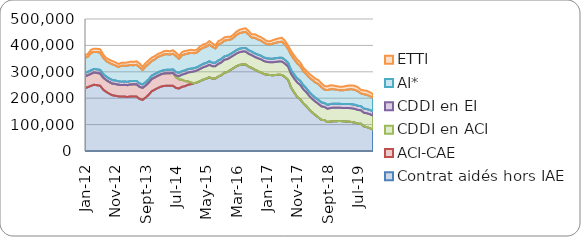
| Category | Contrat aidés hors IAE | ACI-CAE | CDDI en ACI | CDDI en EI | AI* | ETTI |
|---|---|---|---|---|---|---|
| 2012-01-01 | 237785 | 44848 | 7 | 13194 | 56827 | 10405 |
| 2012-02-01 | 242074 | 45184 | 7 | 13142 | 57340 | 10618 |
| 2012-03-01 | 246796 | 45652 | 8 | 13343 | 66093 | 11906 |
| 2012-04-01 | 250992 | 46298 | 9 | 13502 | 64489 | 12020 |
| 2012-05-01 | 249014 | 46348 | 11 | 13611 | 65988 | 12019 |
| 2012-06-01 | 247263 | 46286 | 11 | 13730 | 65047 | 13131 |
| 2012-07-01 | 232485 | 45635 | 12 | 13729 | 60846 | 13000 |
| 2012-08-01 | 223825 | 44702 | 14 | 13555 | 58655 | 11536 |
| 2012-09-01 | 216938 | 44382 | 17 | 13399 | 59007 | 12350 |
| 2012-10-01 | 210990 | 44248 | 18 | 13380 | 59663 | 12602 |
| 2012-11-01 | 209295 | 44434 | 23 | 13281 | 56994 | 12270 |
| 2012-12-01 | 206927 | 44101 | 24 | 13060 | 53786 | 11784 |
| 2013-01-01 | 205907 | 43798 | 34 | 12834 | 60509 | 11172 |
| 2013-02-01 | 206160 | 44418 | 40 | 12826 | 59116 | 11595 |
| 2013-03-01 | 204579 | 44790 | 54 | 12681 | 61223 | 12202 |
| 2013-04-01 | 206628 | 45345 | 71 | 12829 | 60623 | 12795 |
| 2013-05-01 | 206813 | 45599 | 82 | 12848 | 59330 | 12809 |
| 2013-06-01 | 206187 | 46095 | 93 | 13026 | 61038 | 13410 |
| 2013-07-01 | 196970 | 45988 | 111 | 13146 | 61170 | 14219 |
| 2013-08-01 | 193757 | 45309 | 130 | 12918 | 54934 | 12388 |
| 2013-09-01 | 202249 | 45340 | 171 | 12930 | 58926 | 13414 |
| 2013-10-01 | 212900 | 45539 | 205 | 12967 | 58252 | 13732 |
| 2013-11-01 | 226077 | 46096 | 252 | 12853 | 55422 | 12910 |
| 2013-12-01 | 232333 | 46014 | 293 | 12821 | 55158 | 12575 |
| 2014-01-01 | 238519 | 45928 | 308 | 12621 | 58696.797 | 11478 |
| 2014-02-01 | 243617 | 46338 | 306 | 12626 | 57345.516 | 11258 |
| 2014-03-01 | 246353 | 46693 | 313 | 12719 | 59389.413 | 12354 |
| 2014-04-01 | 247451 | 47122 | 315 | 12914 | 58807.382 | 12977 |
| 2014-05-01 | 247315 | 47121 | 302 | 12956 | 57553.107 | 12548 |
| 2014-06-01 | 247042 | 48488 | 318 | 13239 | 59209.953 | 13420 |
| 2014-07-01 | 238890 | 40457 | 6940 | 13160 | 59964 | 13345 |
| 2014-08-01 | 236693 | 34754 | 11660 | 12925 | 53350 | 11352 |
| 2014-09-01 | 243073 | 27006 | 19338 | 13025 | 59881 | 12517 |
| 2014-10-01 | 245548 | 19225 | 27417 | 13017 | 61270 | 12452 |
| 2014-11-01 | 250667 | 12975 | 33878 | 12914 | 58983 | 11655 |
| 2014-12-01 | 253351 | 6151 | 39589 | 12825 | 59612 | 11767 |
| 2015-01-01 | 256470 | 42 | 44848 | 12679 | 56326 | 10779 |
| 2015-02-01 | 259707 | 14 | 45282 | 12631 | 55861 | 11126 |
| 2015-03-01 | 264893 | 7 | 46062 | 12836 | 60557 | 12000 |
| 2015-04-01 | 270425 | 4 | 46551 | 13017 | 61199 | 12554 |
| 2015-05-01 | 274012 | 2 | 46659 | 13065 | 60705 | 12297 |
| 2015-06-01 | 279212 | 2 | 47282 | 13391 | 62866 | 13518 |
| 2015-07-01 | 274133 | 0 | 47007 | 13324 | 60259 | 13458 |
| 2015-08-01 | 274794 | 0 | 46597 | 13160 | 53778 | 11609 |
| 2015-09-01 | 282235 | 0 | 47696 | 13210 | 60301 | 12751 |
| 2015-10-01 | 287385 | 0 | 48336 | 13149 | 59696 | 13129 |
| 2015-11-01 | 296639 | 0 | 48919 | 13239 | 58958 | 12795 |
| 2015-12-01 | 299593 | 0 | 48471 | 13046 | 59158 | 12273 |
| 2016-01-01 | 307271 | 0 | 47593 | 12882 | 54191 | 11102 |
| 2016-02-01 | 314141 | 123 | 47606 | 12909 | 54239 | 11853 |
| 2016-03-01 | 321297 | 125 | 47900 | 13204 | 57281 | 12601 |
| 2016-04-01 | 326134 | 123 | 48128 | 13316 | 58553 | 13016 |
| 2016-05-01 | 328030 | 132 | 48299 | 13499 | 59216 | 13484 |
| 2016-06-01 | 327510 | 127 | 48768 | 13788 | 60936 | 14075 |
| 2016-07-01 | 319399 | 120 | 48513 | 13680 | 58648 | 14002 |
| 2016-08-01 | 314665 | 113 | 47983 | 13655 | 53099 | 12513 |
| 2016-09-01 | 308031 | 105 | 48138 | 13782 | 58580 | 13801 |
| 2016-10-01 | 302249 | 144 | 48993 | 13837 | 57605 | 13373 |
| 2016-11-01 | 297575 | 135 | 49687 | 13846 | 56825 | 13523 |
| 2016-12-01 | 291624 | 41 | 48985 | 13671 | 56446 | 13239 |
| 2017-01-01 | 289138 | 164 | 48026 | 13601 | 53622 | 11946 |
| 2017-02-01 | 287719 | 184 | 48254 | 13723 | 53182 | 12434 |
| 2017-03-01 | 286897 | 183 | 48834 | 13882 | 56855 | 13363 |
| 2017-04-01 | 287997 | 184 | 49476 | 14016 | 58369 | 13649 |
| 2017-05-01 | 288800 | 185 | 49783 | 14331 | 59572 | 14367 |
| 2017-06-01 | 287792 | 220 | 50443 | 14608 | 60970 | 14994 |
| 2017-07-01 | 279641 | 215 | 50564 | 14574 | 57638 | 14540 |
| 2017-08-01 | 269373 | 212 | 49999 | 14586 | 51835 | 13053 |
| 2017-09-01 | 239920 | 252 | 51130 | 14764 | 57781 | 14401 |
| 2017-10-01 | 221546 | 241 | 52627 | 15118 | 57430 | 14422 |
| 2017-11-01 | 205159 | 238 | 54068 | 15526 | 56745 | 14346 |
| 2017-12-01 | 195507 | 132 | 54702 | 15624 | 55809 | 13561 |
| 2018-01-01 | 180717 | 58 | 53153 | 15374 | 53308 | 12951 |
| 2018-02-01 | 170049 | 37 | 52672 | 15102 | 52785 | 13567 |
| 2018-03-01 | 156618 | 36 | 51625 | 14828 | 54869 | 14113 |
| 2018-04-01 | 145646 | 35 | 51086 | 14897 | 57105 | 14401 |
| 2018-05-01 | 135880 | 32 | 50835 | 14906 | 57582 | 14735 |
| 2018-06-01 | 127066 | 0 | 51139 | 15162 | 59722 | 15473 |
| 2018-07-01 | 118216 | 0 | 50724 | 15192 | 57100 | 15037 |
| 2018-08-01 | 116837 | 0 | 49783 | 15074 | 50634 | 13501 |
| 2018-09-01 | 109748 | 0 | 50047 | 15002 | 56000 | 14390 |
| 2018-10-01 | 111858 | 0 | 51045 | 15237 | 55836 | 14929 |
| 2018-11-01 | 112499 | 0 | 51536 | 15217 | 54453 | 14319 |
| 2018-12-01 | 113028 | 0 | 50852 | 15002 | 53058 | 13620 |
| 2019-01-01 | 113461 | 0 | 50093 | 15043 | 51558 | 13191 |
| 2019-02-01 | 112941 | 0 | 50274 | 15113 | 51641 | 13800 |
| 2019-03-01 | 111894 | 0 | 50548 | 15216 | 53749 | 14546 |
| 2019-04-01 | 111173 | 0 | 51553 | 15537 | 55079 | 14880 |
| 2019-05-01 | 109784 | 0 | 51630 | 15647 | 56481 | 14933 |
| 2019-06-01 | 107488 | 0 | 52042 | 15711 | 56329 | 15140 |
| 2019-07-01 | 103684 | 0 | 51800 | 15852 | 54858 | 15442 |
| 2019-08-01 | 103361 | 0 | 50849 | 15697 | 48482 | 13575 |
| 2019-09-01 | 93174 | 0 | 51497 | 15908 | 54177 | 14905 |
| 2019-10-01 | 90403 | 0 | 52421 | 16013 | 53869 | 15113 |
| 2019-11-01 | 86101 | 0 | 53020 | 15931 | 52400 | 14622 |
| 2019-12-01 | 81144 | 0 | 52796 | 15805 | 51848 | 13880 |